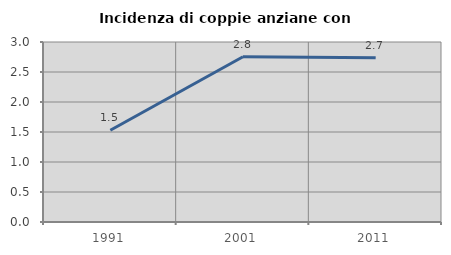
| Category | Incidenza di coppie anziane con figli |
|---|---|
| 1991.0 | 1.53 |
| 2001.0 | 2.755 |
| 2011.0 | 2.736 |